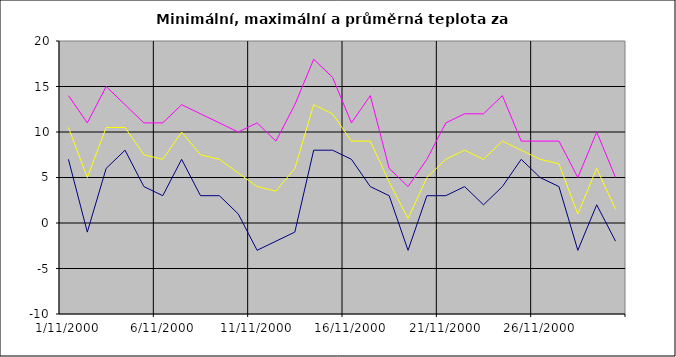
| Category | Series 0 | Series 1 | Series 2 |
|---|---|---|---|
| 2000-11-01 | 7 | 14 | 10.5 |
| 2000-11-02 | -1 | 11 | 5 |
| 2000-11-03 | 6 | 15 | 10.5 |
| 2000-11-04 | 8 | 13 | 10.5 |
| 2000-11-05 | 4 | 11 | 7.5 |
| 2000-11-06 | 3 | 11 | 7 |
| 2000-11-07 | 7 | 13 | 10 |
| 2000-11-08 | 3 | 12 | 7.5 |
| 2000-11-09 | 3 | 11 | 7 |
| 2000-11-10 | 1 | 10 | 5.5 |
| 2000-11-11 | -3 | 11 | 4 |
| 2000-11-12 | -2 | 9 | 3.5 |
| 2000-11-13 | -1 | 13 | 6 |
| 2000-11-14 | 8 | 18 | 13 |
| 2000-11-15 | 8 | 16 | 12 |
| 2000-11-16 | 7 | 11 | 9 |
| 2000-11-17 | 4 | 14 | 9 |
| 2000-11-18 | 3 | 6 | 4.5 |
| 2000-11-19 | -3 | 4 | 0.5 |
| 2000-11-20 | 3 | 7 | 5 |
| 2000-11-21 | 3 | 11 | 7 |
| 2000-11-22 | 4 | 12 | 8 |
| 2000-11-23 | 2 | 12 | 7 |
| 2000-11-24 | 4 | 14 | 9 |
| 2000-11-25 | 7 | 9 | 8 |
| 2000-11-26 | 5 | 9 | 7 |
| 2000-11-27 | 4 | 9 | 6.5 |
| 2000-11-28 | -3 | 5 | 1 |
| 2000-11-29 | 2 | 10 | 6 |
| 2000-11-30 | -2 | 5 | 1.5 |